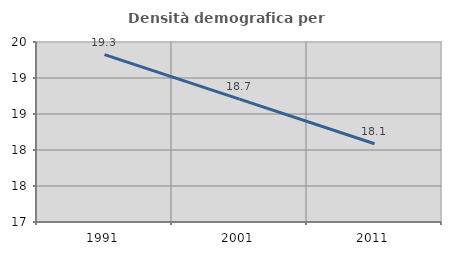
| Category | Densità demografica |
|---|---|
| 1991.0 | 19.326 |
| 2001.0 | 18.706 |
| 2011.0 | 18.087 |